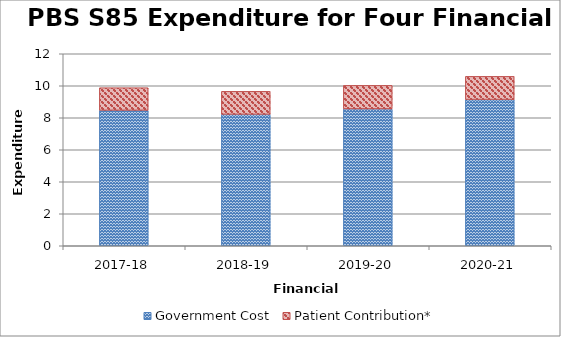
| Category | Government Cost | Patient Contribution* |
|---|---|---|
| 2017-18 | 8463709127.22 | 1415450125.77 |
| 2018-19 | 8211599851.65 | 1440199922.52 |
| 2019-20 | 8552639114.69 | 1471111060.23 |
| 2020-21 | 9136879027.09 | 1450281763.5 |